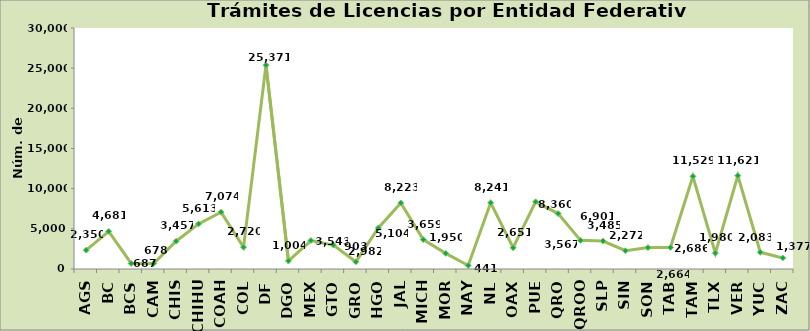
| Category | Series 0 |
|---|---|
| AGS | 2350 |
| BC | 4681 |
| BCS | 687 |
| CAM | 678 |
| CHIS | 3457 |
| CHIHU | 5613 |
| COAH | 7074 |
| COL | 2720 |
| DF | 25371 |
| DGO | 1004 |
| MEX | 3543 |
| GTO | 2982 |
| GRO | 903 |
| HGO | 5104 |
| JAL | 8223 |
| MICH | 3659 |
| MOR | 1950 |
| NAY | 441 |
| NL | 8241 |
| OAX | 2651 |
| PUE | 8360 |
| QRO | 6901 |
| QROO | 3567 |
| SLP | 3485 |
| SIN | 2272 |
| SON | 2664 |
| TAB | 2686 |
| TAM | 11529 |
| TLX | 1980 |
| VER | 11621 |
| YUC | 2083 |
| ZAC | 1377 |